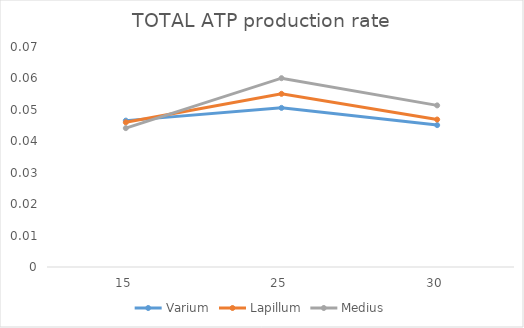
| Category | Varium | Lapillum | Medius |
|---|---|---|---|
| 15.0 | 0.047 | 0.046 | 0.044 |
| 25.0 | 0.051 | 0.055 | 0.06 |
| 30.0 | 0.045 | 0.047 | 0.051 |